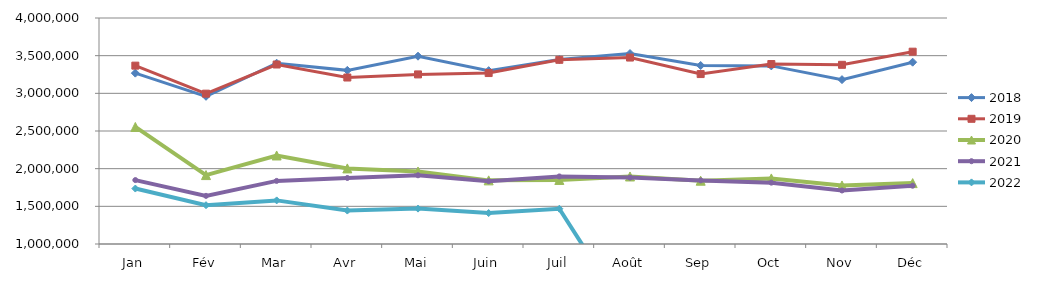
| Category | 2018 | 2019 | 2020 | 2021 | 2022 |
|---|---|---|---|---|---|
| Jan | 3268127.156 | 3367510.542 | 2553542.465 | 1848435.265 | 1735995.843 |
| Fév | 2960518.709 | 2995707.194 | 1914783.421 | 1639009.953 | 1515103.941 |
| Mar | 3399788.443 | 3382590.899 | 2175089.683 | 1837369.769 | 1578824.422 |
| Avr | 3304906.324 | 3209954.832 | 2003293.895 | 1876404.979 | 1443792.337 |
| Mai | 3492911.082 | 3251146.092 | 1962510.702 | 1912345.285 | 1469774.024 |
| Juin | 3300924.802 | 3269085.474 | 1844603.728 | 1833702.622 | 1410516.822 |
| Juil | 3448603.566 | 3445052.713 | 1850370.172 | 1896825.197 | 1468332.039 |
| Août | 3528173.012 | 3474993.525 | 1896365.756 | 1881267.945 | 0 |
| Sep | 3369626.193 | 3255644.054 | 1840205.182 | 1844525.749 | 0 |
| Oct | 3364260.879 | 3388972.2 | 1870450.237 | 1814485.706 | 0 |
| Nov | 3181888.576 | 3378477.919 | 1777011.858 | 1710700.553 | 0 |
| Déc | 3413454.996 | 3552894.26 | 1808480.012 | 1774263.924 | 0 |